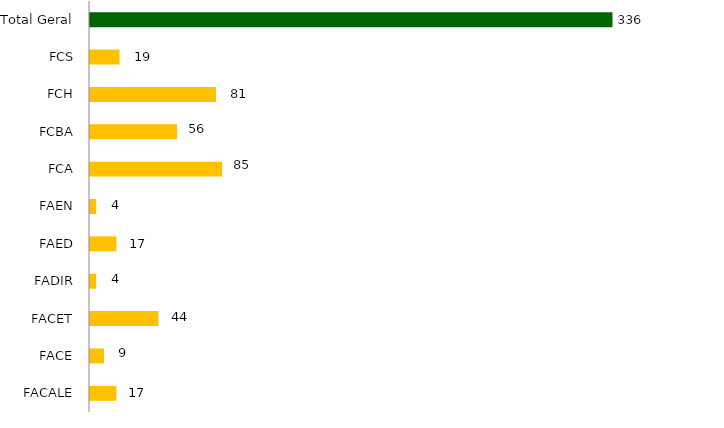
| Category | Faculdade/mês |
|---|---|
| FACALE | 17 |
| FACE | 9 |
| FACET | 44 |
| FADIR | 4 |
| FAED | 17 |
| FAEN | 4 |
| FCA | 85 |
| FCBA | 56 |
| FCH | 81 |
| FCS | 19 |
| Total Geral | 336 |